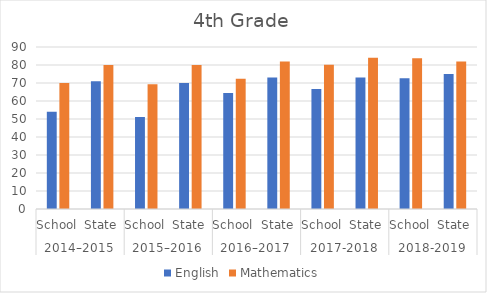
| Category | English | Mathematics |
|---|---|---|
| 0 | 54 | 70 |
| 1 | 71 | 80 |
| 2 | 51.1 | 69.3 |
| 3 | 70 | 80 |
| 4 | 64.5 | 72.3 |
| 5 | 73 | 82 |
| 6 | 66.7 | 80.2 |
| 7 | 73 | 84 |
| 8 | 72.6 | 83.7 |
| 9 | 75 | 82 |